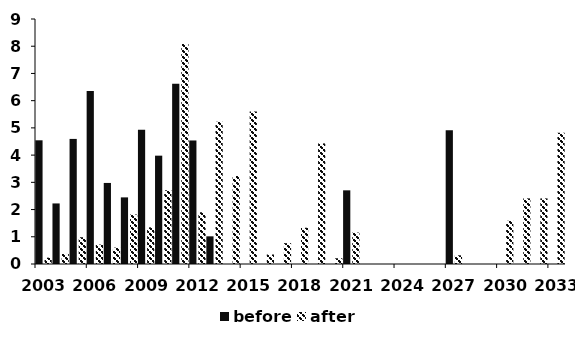
| Category | before | after |
|---|---|---|
| 2003 | 4.544 | 0.232 |
| 2004 | 2.225 | 0.369 |
| 2005 | 4.595 | 0.984 |
| 2006 | 6.353 | 0.714 |
| 2007 | 2.978 | 0.602 |
| 2008 | 2.447 | 1.818 |
| 2009 | 4.929 | 1.347 |
| 2010 | 3.98 | 2.708 |
| 2011 | 6.618 | 8.086 |
| 2012 | 4.538 | 1.901 |
| 2013 | 1.017 | 5.221 |
| 2014 | 0 | 3.232 |
| 2015 | 0 | 5.599 |
| 2016 | 0 | 0.349 |
| 2017 | 0 | 0.766 |
| 2018 | 0 | 1.333 |
| 2019 | 0 | 4.43 |
| 2020 | 0 | 0.211 |
| 2021 | 2.706 | 1.155 |
| 2022 | 0 | 0 |
| 2023 | 0 | 0 |
| 2024 | 0 | 0 |
| 2025 | 0 | 0 |
| 2026 | 0 | 0 |
| 2027 | 4.917 | 0.32 |
| 2028 | 0 | 0 |
| 2029 | 0 | 0 |
| 2030 | 0 | 1.587 |
| 2031 | 0 | 2.41 |
| 2032 | 0 | 2.41 |
| 2033 | 0 | 4.821 |